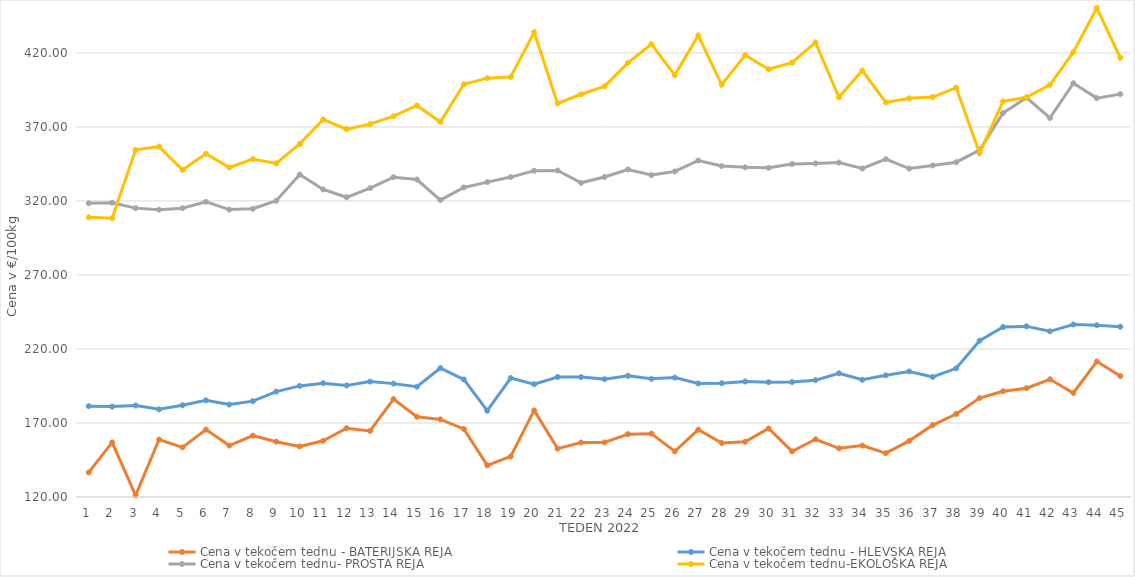
| Category | Cena v tekočem tednu - BATERIJSKA REJA | Cena v tekočem tednu - HLEVSKA REJA | Cena v tekočem tednu- PROSTA REJA | Cena v tekočem tednu-EKOLOŠKA REJA |
|---|---|---|---|---|
| 1.0 | 136.59 | 181.38 | 318.4 | 308.97 |
| 2.0 | 156.88 | 181.07 | 318.82 | 308.28 |
| 3.0 | 121.07 | 181.83 | 315.14 | 354.48 |
| 4.0 | 158.82 | 179.22 | 314.08 | 356.72 |
| 5.0 | 153.55 | 181.96 | 315.1 | 341.03 |
| 6.0 | 165.51 | 185.31 | 319.38 | 351.9 |
| 7.0 | 154.74 | 182.45 | 314.16 | 342.59 |
| 8.0 | 161.48 | 184.77 | 314.71 | 348.28 |
| 9.0 | 157.38 | 191.21 | 320.1 | 345.35 |
| 10.0 | 154.16 | 195.04 | 337.83 | 358.45 |
| 11.0 | 157.96 | 196.88 | 327.79 | 375 |
| 12.0 | 166.49 | 195.36 | 322.46 | 368.45 |
| 13.0 | 164.66 | 197.95 | 328.67 | 371.9 |
| 14.0 | 186.11 | 196.59 | 336.02 | 377.24 |
| 15.0 | 174.18 | 194.49 | 334.46 | 384.48 |
| 16.0 | 172.42 | 207.1 | 320.58 | 373.28 |
| 17.0 | 165.96 | 199.41 | 329.11 | 398.79 |
| 18.0 | 141.36 | 178.29 | 332.71 | 402.93 |
| 19.0 | 147.43 | 200.37 | 336.11 | 403.79 |
| 20.0 | 178.51 | 196.16 | 340.4 | 433.97 |
| 21.0 | 152.67 | 201.05 | 340.55 | 385.86 |
| 22.0 | 156.8 | 200.98 | 332.23 | 392.07 |
| 23.0 | 156.84 | 199.63 | 336.16 | 397.41 |
| 24.0 | 162.44 | 201.86 | 341.24 | 413.28 |
| 25.0 | 162.78 | 199.81 | 337.48 | 425.86 |
| 26.0 | 150.82 | 200.65 | 339.9 | 405 |
| 27.0 | 165.45 | 196.64 | 347.3 | 431.72 |
| 28.0 | 156.46 | 196.88 | 343.56 | 398.45 |
| 29.0 | 157.31 | 198.03 | 342.71 | 418.45 |
| 30.0 | 166.29 | 197.55 | 342.35 | 408.97 |
| 31.0 | 150.81 | 197.66 | 344.97 | 413.45 |
| 32.0 | 158.99 | 198.9 | 345.35 | 427.07 |
| 33.0 | 152.91 | 203.57 | 345.9 | 390 |
| 34.0 | 154.73 | 199.17 | 341.92 | 408.1 |
| 35.0 | 149.6 | 202.21 | 348.2 | 386.55 |
| 36.0 | 157.93 | 204.81 | 341.85 | 389.31 |
| 37.0 | 168.61 | 201.11 | 343.97 | 390.17 |
| 38.0 | 176.07 | 206.91 | 346.16 | 396.55 |
| 39.0 | 186.86 | 225.6 | 354.41 | 352.24 |
| 40.0 | 191.45 | 234.79 | 379.35 | 387.24 |
| 41.0 | 193.52 | 235.24 | 389.75 | 390 |
| 42.0 | 199.51 | 231.92 | 376.02 | 398.45 |
| 43.0 | 190.28 | 236.56 | 399.51 | 420.52 |
| 44.0 | 211.53 | 236.04 | 389.44 | 450.35 |
| 45.0 | 201.69 | 235.01 | 392.15 | 416.72 |